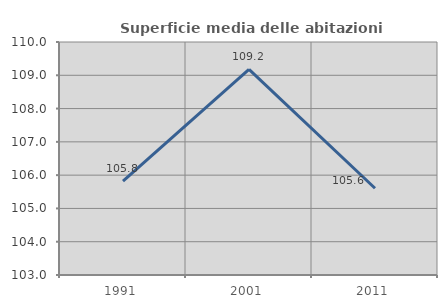
| Category | Superficie media delle abitazioni occupate |
|---|---|
| 1991.0 | 105.82 |
| 2001.0 | 109.175 |
| 2011.0 | 105.606 |